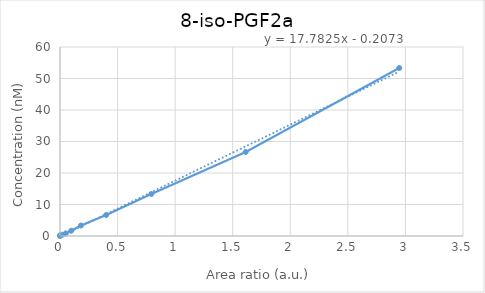
| Category | 8-iso-PGF2a |
|---|---|
| 0.0 | 0 |
| 0.000110793782747251 | 0.208 |
| 0.0204744191699465 | 0.417 |
| 0.0496747528987435 | 0.833 |
| 0.0972792712571171 | 1.667 |
| 0.182313563805931 | 3.333 |
| 0.401039136221769 | 6.667 |
| 0.79317676714293 | 13.333 |
| 1.61300604154431 | 26.667 |
| 2.94621628740488 | 53.333 |